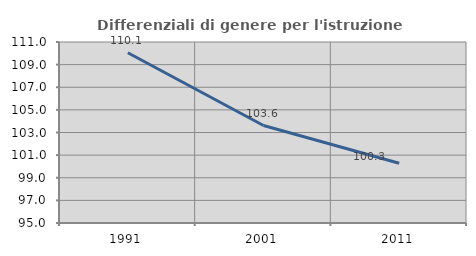
| Category | Differenziali di genere per l'istruzione superiore |
|---|---|
| 1991.0 | 110.053 |
| 2001.0 | 103.618 |
| 2011.0 | 100.279 |